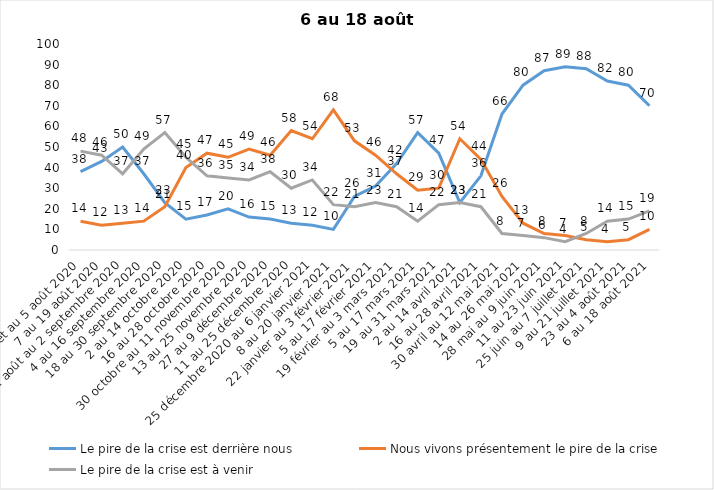
| Category | Le pire de la crise est derrière nous | Nous vivons présentement le pire de la crise | Le pire de la crise est à venir |
|---|---|---|---|
| 24 juillet au 5 août 2020 | 38 | 14 | 48 |
| 7 au 19 août 2020 | 43 | 12 | 46 |
| 21 août au 2 septembre 2020 | 50 | 13 | 37 |
| 4 au 16 septembre 2020 | 37 | 14 | 49 |
| 18 au 30 septembre 2020 | 23 | 21 | 57 |
| 2 au 14 octobre 2020 | 15 | 40 | 45 |
| 16 au 28 octobre 2020 | 17 | 47 | 36 |
| 30 octobre au 11 novembre 2020 | 20 | 45 | 35 |
| 13 au 25 novembre 2020 | 16 | 49 | 34 |
| 27 au 9 décembre 2020 | 15 | 46 | 38 |
| 11 au 25 décembre 2020 | 13 | 58 | 30 |
| 25 décembre 2020 au 6 janvier 2021 | 12 | 54 | 34 |
| 8 au 20 janvier 2021 | 10 | 68 | 22 |
| 22 janvier au 3 février 2021 | 26 | 53 | 21 |
| 5 au 17 février 2021 | 31 | 46 | 23 |
| 19 février au 3 mars 2021 | 42 | 37 | 21 |
| 5 au 17 mars 2021 | 57 | 29 | 14 |
| 19 au 31 mars 2021 | 47 | 30 | 22 |
| 2 au 14 avril 2021 | 23 | 54 | 23 |
| 16 au 28 avril 2021 | 36 | 44 | 21 |
| 30 avril au 12 mai 2021 | 66 | 26 | 8 |
| 14 au 26 mai 2021 | 80 | 13 | 7 |
| 28 mai au 9 juin 2021 | 87 | 8 | 6 |
| 11 au 23 juin 2021 | 89 | 7 | 4 |
| 25 juin au 7 juillet 2021 | 88 | 5 | 8 |
| 9 au 21 juillet 2021 | 82 | 4 | 14 |
| 23 au 4 août 2021 | 80 | 5 | 15 |
| 6 au 18 août 2021 | 70 | 10 | 19 |